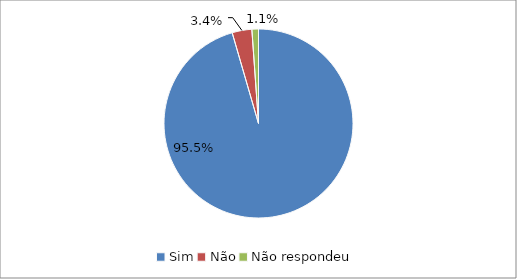
| Category | Series 0 |
|---|---|
| Sim | 0.955 |
| Não | 0.034 |
| Não respondeu | 0.011 |